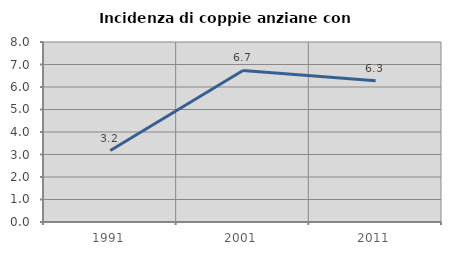
| Category | Incidenza di coppie anziane con figli |
|---|---|
| 1991.0 | 3.178 |
| 2001.0 | 6.737 |
| 2011.0 | 6.279 |